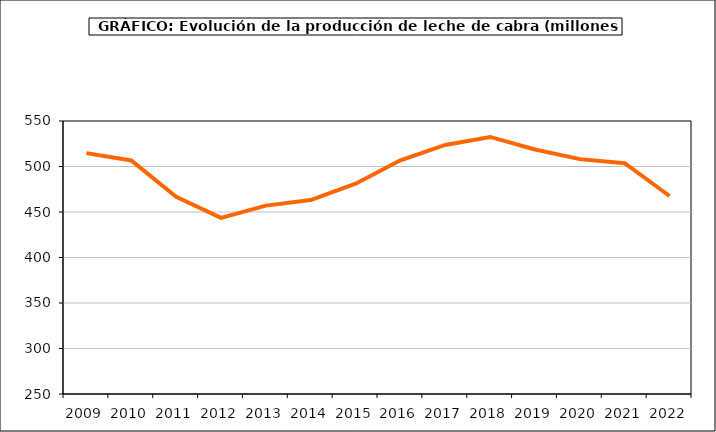
| Category | leche cabra |
|---|---|
| 2009.0 | 514.7 |
| 2010.0 | 506.6 |
| 2011.0 | 466.7 |
| 2012.0 | 443.6 |
| 2013.0 | 457 |
| 2014.0 | 463.1 |
| 2015.0 | 481.1 |
| 2016.0 | 506.8 |
| 2017.0 | 523.7 |
| 2018.0 | 532.5 |
| 2019.0 | 518.7 |
| 2020.0 | 508.1 |
| 2021.0 | 503.584 |
| 2022.0 | 467.584 |